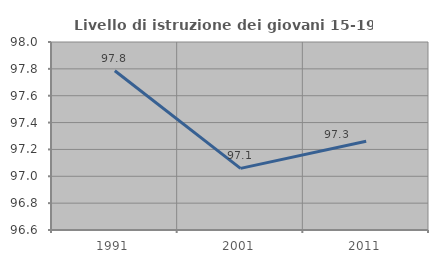
| Category | Livello di istruzione dei giovani 15-19 anni |
|---|---|
| 1991.0 | 97.786 |
| 2001.0 | 97.059 |
| 2011.0 | 97.26 |